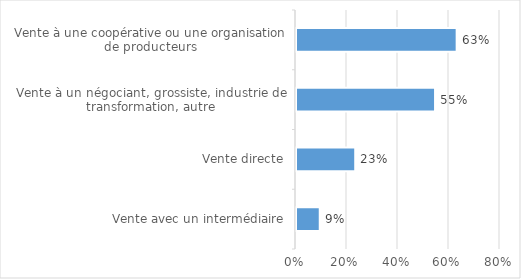
| Category | Series 0 |
|---|---|
| Vente avec un intermédiaire | 0.093 |
| Vente directe | 0.232 |
| Vente à un négociant, grossiste, industrie de transformation, autre | 0.545 |
| Vente à une coopérative ou une organisation de producteurs | 0.63 |